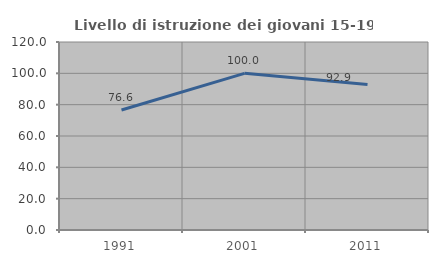
| Category | Livello di istruzione dei giovani 15-19 anni |
|---|---|
| 1991.0 | 76.562 |
| 2001.0 | 100 |
| 2011.0 | 92.857 |